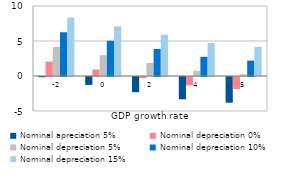
| Category | Nominal apreciation 5% | Nominal depreciation 0% | Nominal depreciation 5% | Nominal depreciation 10% | Nominal depreciation 15% |
|---|---|---|---|---|---|
| -2.0 | -0.036 | 2.059 | 4.154 | 6.249 | 8.344 |
| 0.0 | -1.127 | 0.927 | 2.98 | 5.033 | 7.086 |
| 2.0 | -2.174 | -0.162 | 1.851 | 3.864 | 5.877 |
| 4.0 | -3.182 | -1.208 | 0.766 | 2.741 | 4.715 |
| 5.0 | -3.671 | -1.716 | 0.24 | 2.195 | 4.15 |